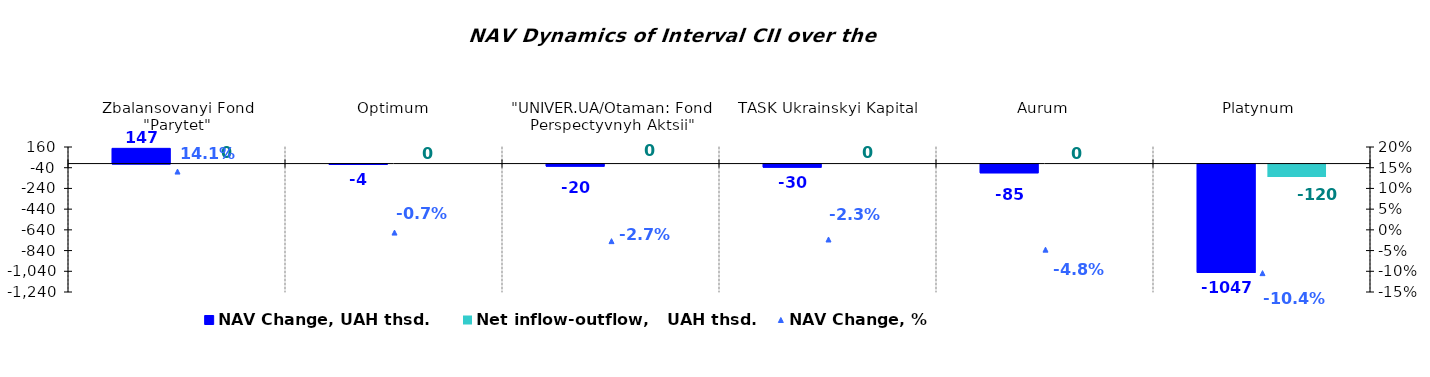
| Category | NAV Change, UAH thsd. | Net inflow-outflow,   UAH thsd. |
|---|---|---|
| Zbalansovanyi Fond "Parytet" | 146.888 | 0 |
| Optimum | -4.151 | 0 |
| "UNIVER.UA/Otaman: Fond Perspectyvnyh Aktsii" | -19.977 | 0 |
| TASK Ukrainskyi Kapital | -30.208 | 0 |
| Аurum | -84.897 | 0 |
| Platynum  | -1046.993 | -119.845 |